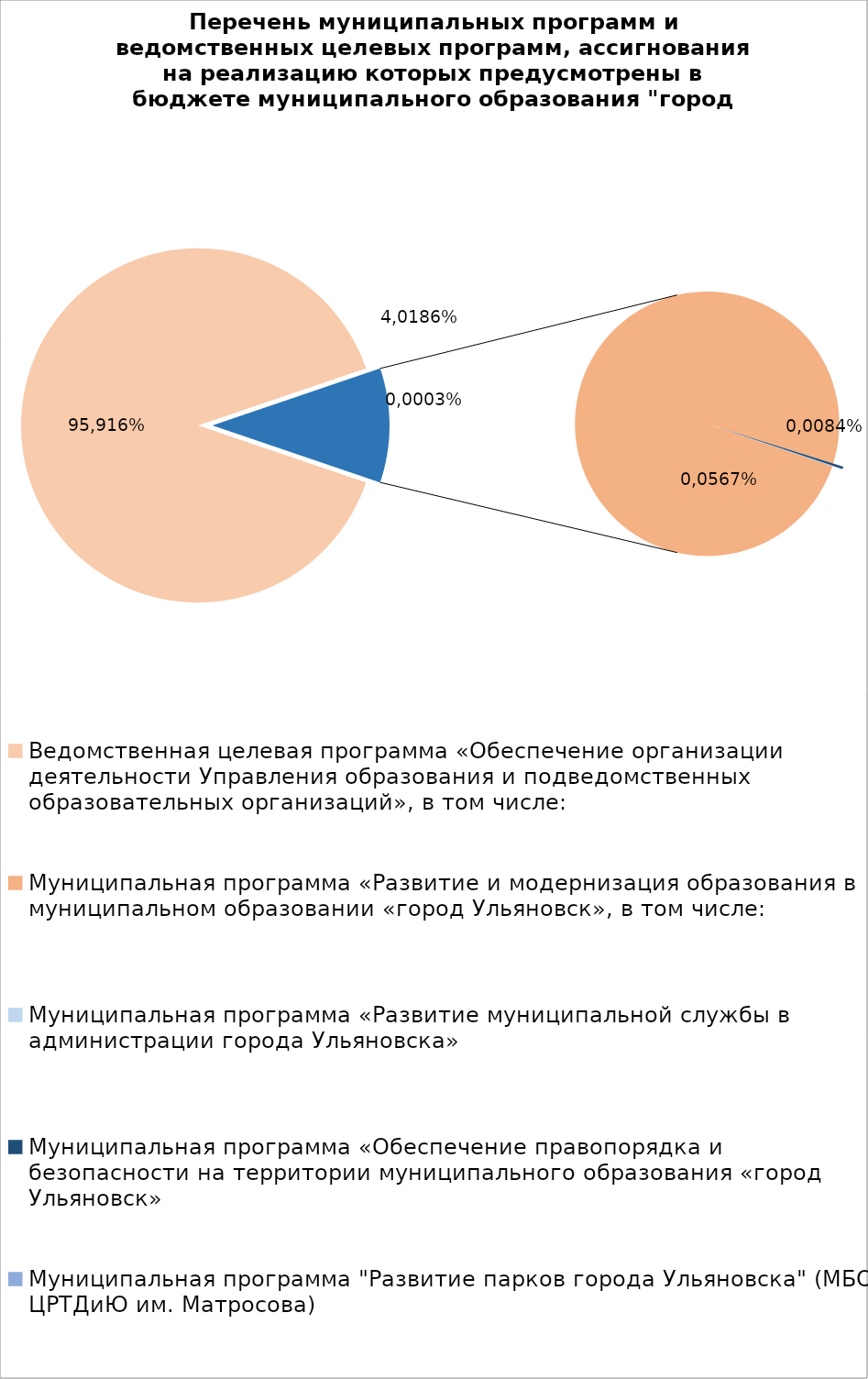
| Category | Series 0 |
|---|---|
| Ведомственная целевая программа «Обеспечение организации деятельности Управления образования и подведомственных образовательных организаций», в том числе: | 7862197.47 |
| Муниципальная программа «Развитие и модернизация образования в муниципальном образовании «город Ульяновск», в том числе: | 910979.7 |
| Муниципальная программа «Развитие муниципальной службы в администрации города Ульяновска» | 14.3 |
| Муниципальная программа «Обеспечение правопорядка и безопасности на территории муниципального образования «город Ульяновск» | 2700 |
| Муниципальная программа "Развитие парков города Ульяновска" (МБОУ ЦРТДиЮ им. Матросова) | 600 |